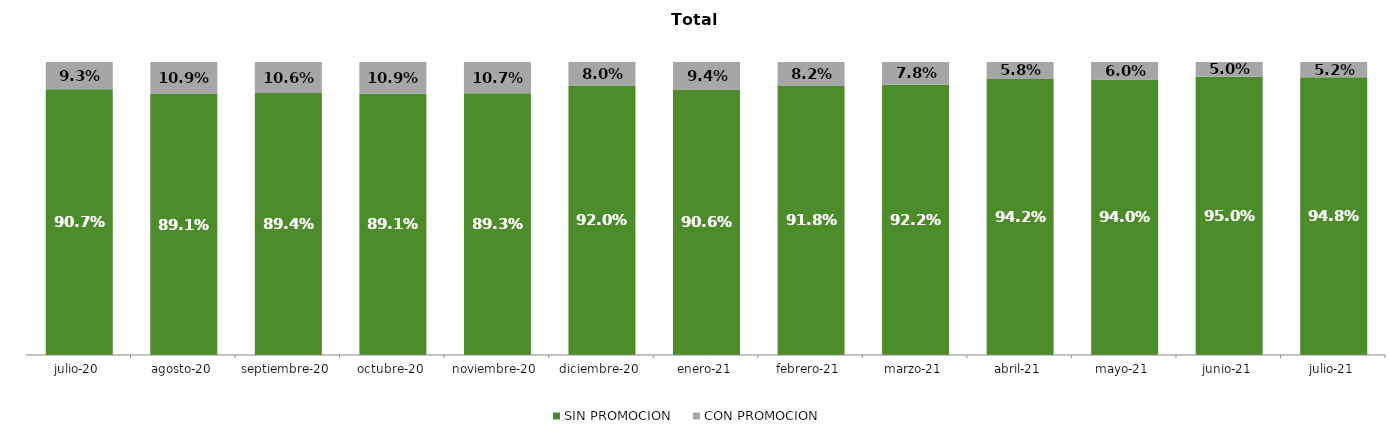
| Category | SIN PROMOCION   | CON PROMOCION   |
|---|---|---|
| 2020-07-01 | 0.907 | 0.093 |
| 2020-08-01 | 0.891 | 0.109 |
| 2020-09-01 | 0.894 | 0.106 |
| 2020-10-01 | 0.891 | 0.109 |
| 2020-11-01 | 0.893 | 0.107 |
| 2020-12-01 | 0.92 | 0.08 |
| 2021-01-01 | 0.906 | 0.094 |
| 2021-02-01 | 0.918 | 0.082 |
| 2021-03-01 | 0.922 | 0.078 |
| 2021-04-01 | 0.942 | 0.058 |
| 2021-05-01 | 0.94 | 0.06 |
| 2021-06-01 | 0.95 | 0.05 |
| 2021-07-01 | 0.948 | 0.052 |